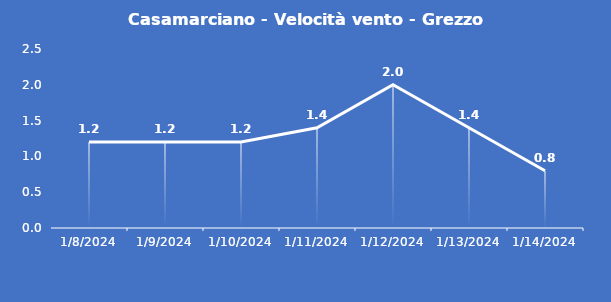
| Category | Casamarciano - Velocità vento - Grezzo (m/s) |
|---|---|
| 1/8/24 | 1.2 |
| 1/9/24 | 1.2 |
| 1/10/24 | 1.2 |
| 1/11/24 | 1.4 |
| 1/12/24 | 2 |
| 1/13/24 | 1.4 |
| 1/14/24 | 0.8 |